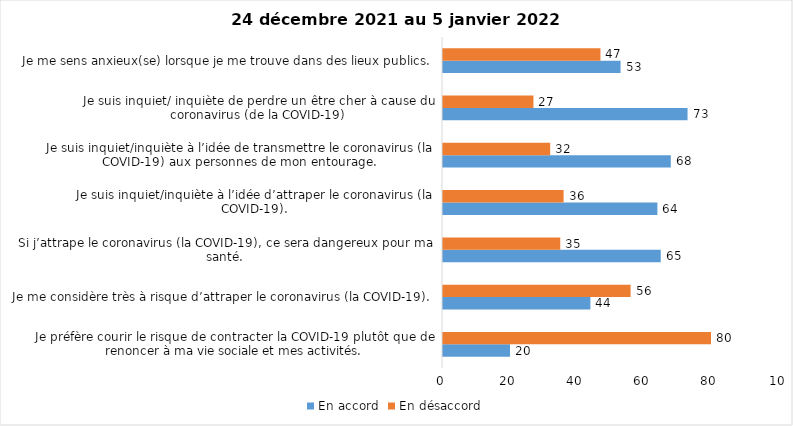
| Category | En accord | En désaccord |
|---|---|---|
| Je préfère courir le risque de contracter la COVID-19 plutôt que de renoncer à ma vie sociale et mes activités. | 20 | 80 |
| Je me considère très à risque d’attraper le coronavirus (la COVID-19). | 44 | 56 |
| Si j’attrape le coronavirus (la COVID-19), ce sera dangereux pour ma santé. | 65 | 35 |
| Je suis inquiet/inquiète à l’idée d’attraper le coronavirus (la COVID-19). | 64 | 36 |
| Je suis inquiet/inquiète à l’idée de transmettre le coronavirus (la COVID-19) aux personnes de mon entourage. | 68 | 32 |
| Je suis inquiet/ inquiète de perdre un être cher à cause du coronavirus (de la COVID-19) | 73 | 27 |
| Je me sens anxieux(se) lorsque je me trouve dans des lieux publics. | 53 | 47 |